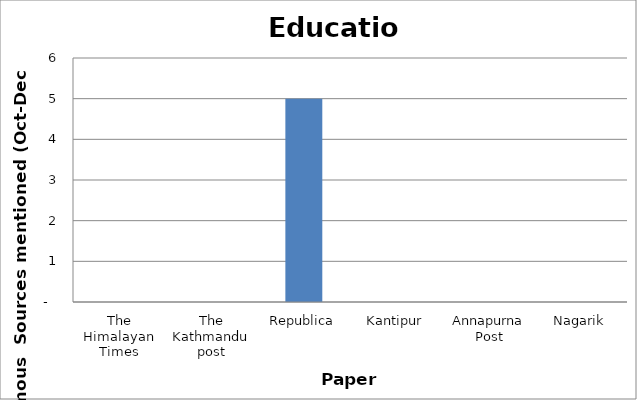
| Category | Education |
|---|---|
| The Himalayan Times | 0 |
| The Kathmandu post | 0 |
| Republica | 5 |
| Kantipur | 0 |
| Annapurna Post | 0 |
| Nagarik | 0 |